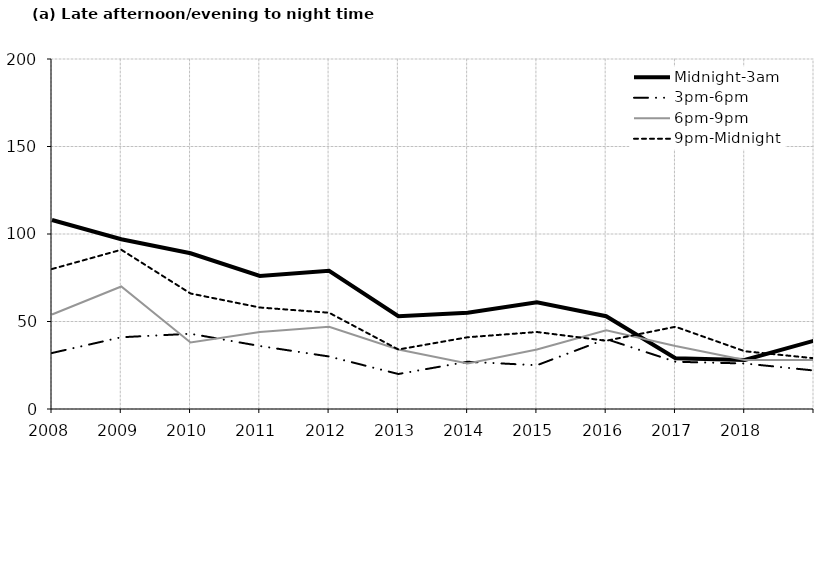
| Category | Midnight-3am | 3pm-6pm | 6pm-9pm | 9pm-Midnight |
|---|---|---|---|---|
| 2008.0 | 108 | 32 | 54 | 80 |
| 2009.0 | 97 | 41 | 70 | 91 |
| 2010.0 | 89 | 43 | 38 | 66 |
| 2011.0 | 76 | 36 | 44 | 58 |
| 2012.0 | 79 | 30 | 47 | 55 |
| 2013.0 | 53 | 20 | 34 | 34 |
| 2014.0 | 55 | 27 | 26 | 41 |
| 2015.0 | 61 | 25 | 34 | 44 |
| 2016.0 | 53 | 40 | 45 | 39 |
| 2017.0 | 29 | 27 | 36 | 47 |
| 2018.0 | 28 | 26 | 28 | 33 |